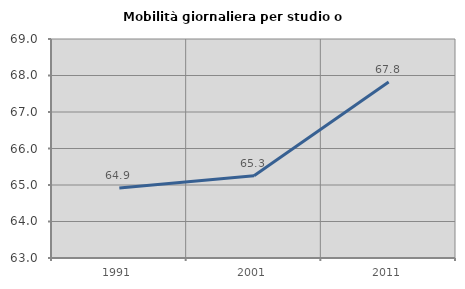
| Category | Mobilità giornaliera per studio o lavoro |
|---|---|
| 1991.0 | 64.918 |
| 2001.0 | 65.254 |
| 2011.0 | 67.824 |